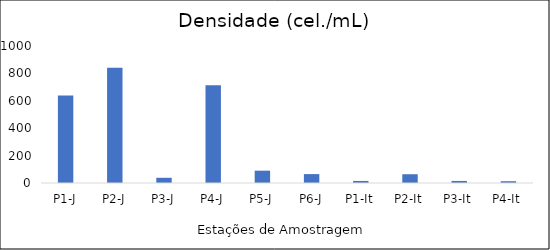
| Category | Series 0 |
|---|---|
| P1-J | 639 |
| P2-J | 842 |
| P3-J | 38 |
| P4-J | 713 |
| P5-J | 90 |
| P6-J | 65 |
| P1-It | 15 |
| P2-It | 64 |
| P3-It | 15 |
| P4-It | 13 |